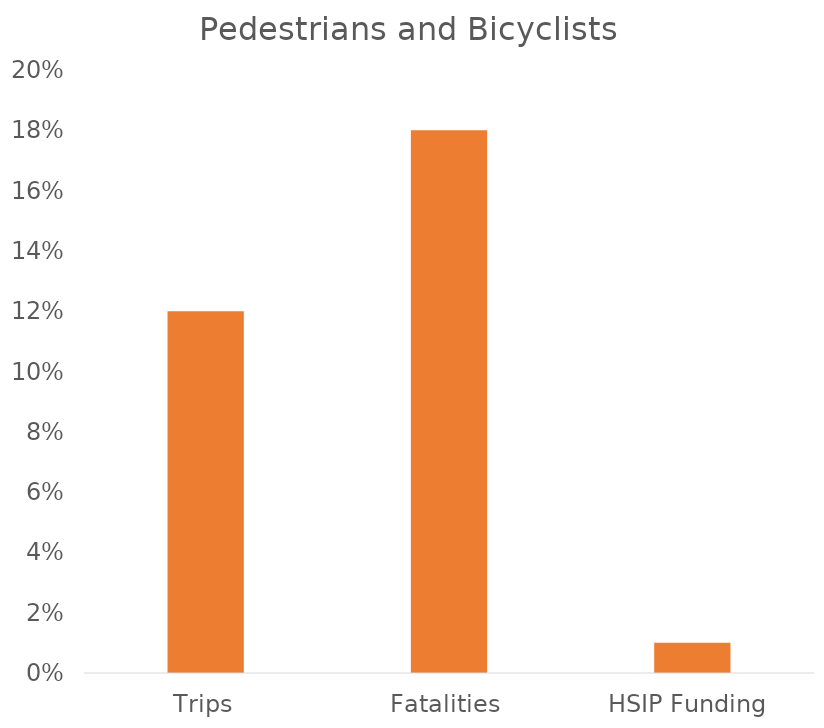
| Category | Pedestrians and Bicyclists |
|---|---|
| Trips | 0.12 |
| Fatalities | 0.18 |
| HSIP Funding | 0.01 |